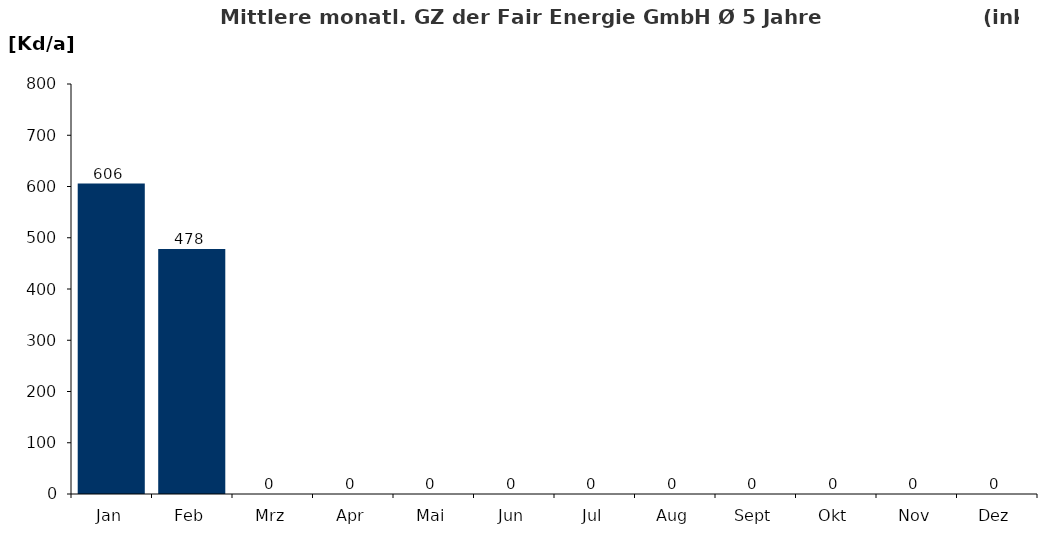
| Category | Gradtagszahl |
|---|---|
| Jan | 605.68 |
| Feb | 478.22 |
| Mrz | 0 |
| Apr | 0 |
| Mai | 0 |
| Jun | 0 |
| Jul | 0 |
| Aug | 0 |
| Sept | 0 |
| Okt | 0 |
| Nov | 0 |
| Dez | 0 |